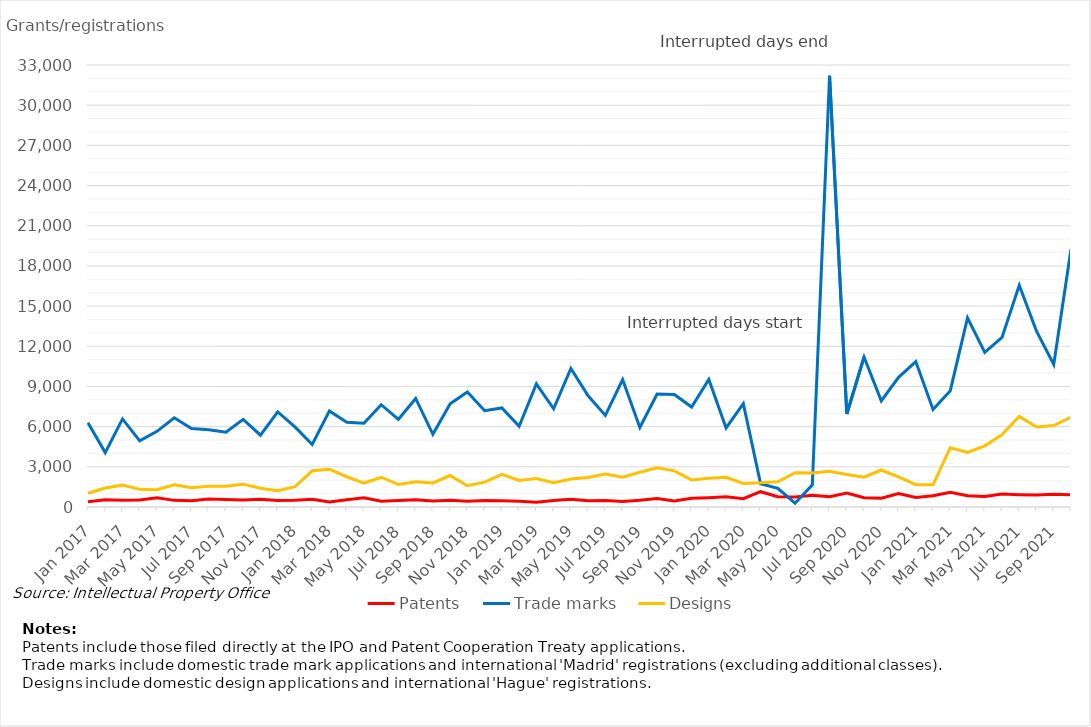
| Category | Patents | Trade marks | Designs |
|---|---|---|---|
| Jan 2017 | 387 | 6288 | 1026 |
| Feb 2017 | 533 | 4063 | 1420 |
| Mar 2017 | 505 | 6576 | 1631 |
| Apr 2017 | 516 | 4937 | 1318 |
| May 2017 | 681 | 5651 | 1284 |
| Jun 2017 | 495 | 6659 | 1660 |
| Jul 2017 | 466 | 5857 | 1437 |
| Aug 2017 | 592 | 5763 | 1550 |
| Sep 2017 | 554 | 5578 | 1553 |
| Oct 2017 | 517 | 6539 | 1705 |
| Nov 2017 | 578 | 5364 | 1397 |
| Dec 2017 | 487 | 7101 | 1218 |
| Jan 2018 | 495 | 5978 | 1512 |
| Feb 2018 | 574 | 4670 | 2704 |
| Mar 2018 | 370 | 7176 | 2825 |
| Apr 2018 | 543 | 6332 | 2259 |
| May 2018 | 690 | 6251 | 1789 |
| Jun 2018 | 424 | 7636 | 2222 |
| Jul 2018 | 486 | 6547 | 1678 |
| Aug 2018 | 536 | 8103 | 1878 |
| Sep 2018 | 450 | 5426 | 1795 |
| Oct 2018 | 498 | 7699 | 2348 |
| Nov 2018 | 432 | 8591 | 1592 |
| Dec 2018 | 484 | 7189 | 1859 |
| Jan 2019 | 475 | 7393 | 2444 |
| Feb 2019 | 426 | 6021 | 1987 |
| Mar 2019 | 363 | 9184 | 2125 |
| Apr 2019 | 488 | 7335 | 1810 |
| May 2019 | 573 | 10345 | 2096 |
| Jun 2019 | 471 | 8304 | 2202 |
| Jul 2019 | 489 | 6839 | 2464 |
| Aug 2019 | 420 | 9515 | 2218 |
| Sep 2019 | 500 | 5942 | 2596 |
| Oct 2019 | 634 | 8436 | 2926 |
| Nov 2019 | 455 | 8398 | 2700 |
| Dec 2019 | 654 | 7465 | 2021 |
| Jan 2020 | 696 | 9517 | 2145 |
| Feb 2020 | 756 | 5905 | 2220 |
| Mar 2020 | 622 | 7719 | 1758 |
| Apr 2020 | 1143 | 1741 | 1803 |
| May 2020 | 768 | 1398 | 1888 |
| Jun 2020 | 740 | 280 | 2564 |
| Jul 2020 | 878 | 1657 | 2539 |
| Aug 2020 | 771 | 32198 | 2665 |
| Sep 2020 | 1042 | 6941 | 2425 |
| Oct 2020 | 697 | 11197 | 2223 |
| Nov 2020 | 649 | 7926 | 2763 |
| Dec 2020 | 1010 | 9680 | 2252 |
| Jan 2021 | 708 | 10856 | 1665 |
| Feb 2021 | 838 | 7287 | 1660 |
| Mar 2021 | 1107 | 8686 | 4430 |
| Apr 2021 | 838 | 14120 | 4079 |
| May 2021 | 788 | 11543 | 4569 |
| Jun 2021 | 972 | 12656 | 5402 |
| Jul 2021 | 918 | 16550 | 6757 |
| Aug 2021 | 887 | 13125 | 5970 |
| Sep 2021 | 947 | 10642 | 6077 |
| Oct 2021 | 920 | 19256 | 6703 |